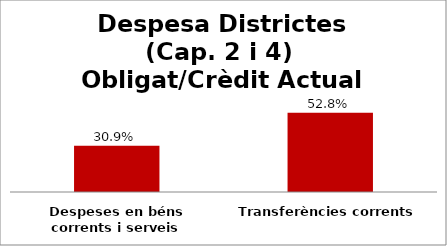
| Category | Series 0 |
|---|---|
| Despeses en béns corrents i serveis | 0.309 |
| Transferències corrents | 0.528 |